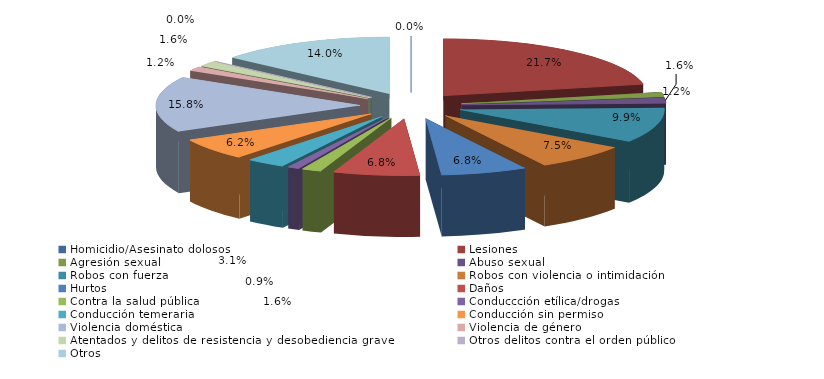
| Category | Series 0 |
|---|---|
| Homicidio/Asesinato dolosos | 0 |
| Lesiones | 70 |
| Agresión sexual | 4 |
| Abuso sexual | 5 |
| Robos con fuerza | 32 |
| Robos con violencia o intimidación | 24 |
| Hurtos | 22 |
| Daños | 22 |
| Contra la salud pública | 5 |
| Conduccción etílica/drogas | 3 |
| Conducción temeraria | 10 |
| Conducción sin permiso | 20 |
| Violencia doméstica | 51 |
| Violencia de género | 4 |
| Atentados y delitos de resistencia y desobediencia grave | 5 |
| Otros delitos contra el orden público | 0 |
| Otros | 45 |